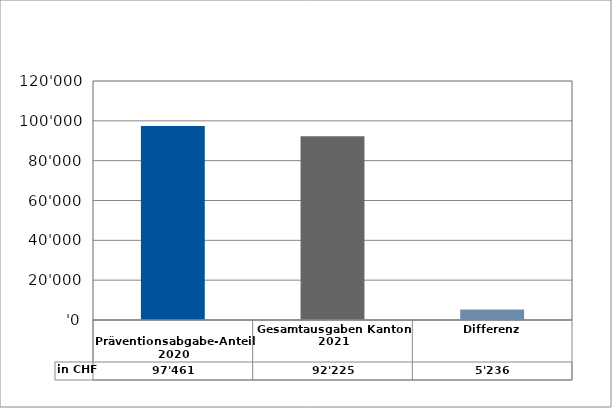
| Category | in CHF |
|---|---|
| 
Präventionsabgabe-Anteil 2020

 | 97460.75 |
| Gesamtausgaben Kanton 2021
 | 92225 |
| Differenz | 5235.75 |